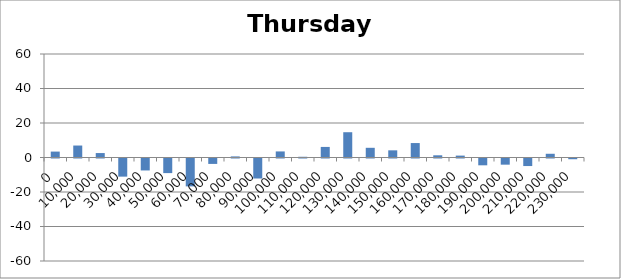
| Category | Thursday 24 |
|---|---|
| 0.0 | 3.429 |
| 10000.0 | 6.938 |
| 20000.0 | 2.576 |
| 30000.0 | -10.514 |
| 40000.0 | -6.929 |
| 50000.0 | -8.467 |
| 60000.0 | -16.162 |
| 70000.0 | -3.143 |
| 80000.0 | 0.633 |
| 90000.0 | -11.595 |
| 100000.0 | 3.519 |
| 110000.0 | 0.424 |
| 120000.0 | 6.129 |
| 130000.0 | 14.657 |
| 140000.0 | 5.619 |
| 150000.0 | 4.152 |
| 160000.0 | 8.376 |
| 170000.0 | 1.276 |
| 180000.0 | 1.095 |
| 190000.0 | -3.948 |
| 200000.0 | -3.576 |
| 210000.0 | -4.376 |
| 220000.0 | 2.16 |
| 230000.0 | -0.42 |